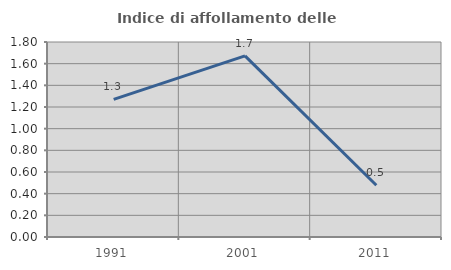
| Category | Indice di affollamento delle abitazioni  |
|---|---|
| 1991.0 | 1.27 |
| 2001.0 | 1.671 |
| 2011.0 | 0.477 |